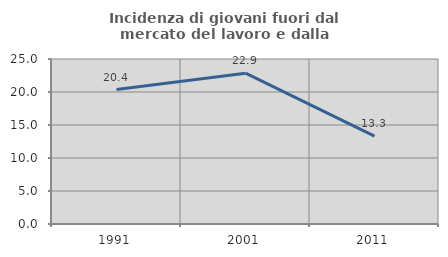
| Category | Incidenza di giovani fuori dal mercato del lavoro e dalla formazione  |
|---|---|
| 1991.0 | 20.37 |
| 2001.0 | 22.857 |
| 2011.0 | 13.305 |